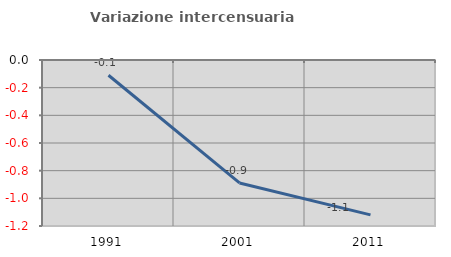
| Category | Variazione intercensuaria annua |
|---|---|
| 1991.0 | -0.11 |
| 2001.0 | -0.889 |
| 2011.0 | -1.12 |